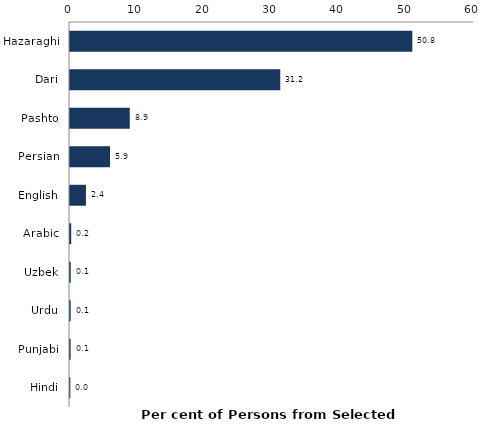
| Category | Series 0 |
|---|---|
| Hazaraghi | 50.844 |
| Dari | 31.227 |
| Pashto | 8.878 |
| Persian | 5.941 |
| English | 2.366 |
| Arabic | 0.181 |
| Uzbek | 0.115 |
| Urdu | 0.107 |
| Punjabi | 0.094 |
| Hindi | 0.049 |